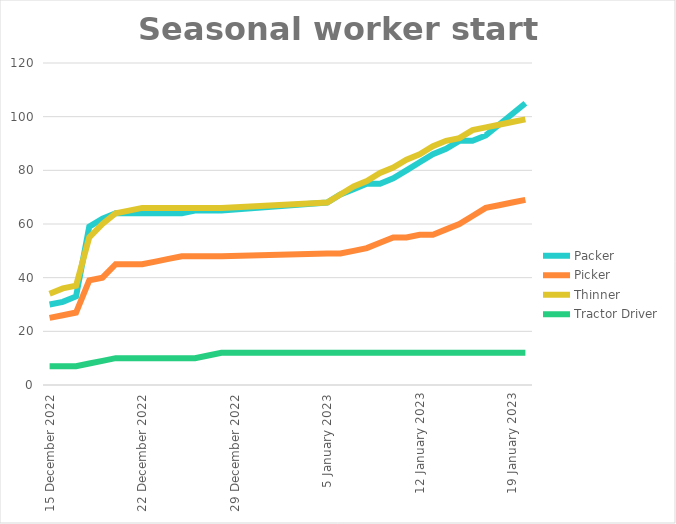
| Category | Packer | Picker | Thinner | Tractor Driver |
|---|---|---|---|---|
| 2022-12-15 | 30 | 25 | 34 | 7 |
| 2022-12-16 | 31 | 26 | 36 | 7 |
| 2022-12-17 | 33 | 27 | 37 | 7 |
| 2022-12-18 | 59 | 39 | 55 | 8 |
| 2022-12-19 | 62 | 40 | 60 | 9 |
| 2022-12-20 | 64 | 45 | 64 | 10 |
| 2022-12-21 | 64 | 45 | 65 | 10 |
| 2022-12-22 | 64 | 45 | 66 | 10 |
| 2022-12-23 | 64 | 46 | 66 | 10 |
| 2022-12-24 | 64 | 47 | 66 | 10 |
| 2022-12-25 | 64 | 48 | 66 | 10 |
| 2022-12-26 | 65 | 48 | 66 | 10 |
| 2022-12-27 | 65 | 48 | 66 | 11 |
| 2022-12-28 | 65 | 48 | 66 | 12 |
| 2023-01-05 | 68 | 49 | 68 | 12 |
| 2023-01-06 | 71 | 49 | 71 | 12 |
| 2023-01-07 | 73 | 50 | 74 | 12 |
| 2023-01-08 | 75 | 51 | 76 | 12 |
| 2023-01-09 | 75 | 53 | 79 | 12 |
| 2023-01-10 | 77 | 55 | 81 | 12 |
| 2023-01-11 | 80 | 55 | 84 | 12 |
| 2023-01-12 | 83 | 56 | 86 | 12 |
| 2023-01-13 | 86 | 56 | 89 | 12 |
| 2023-01-14 | 88 | 58 | 91 | 12 |
| 2023-01-15 | 91 | 60 | 92 | 12 |
| 2023-01-16 | 91 | 63 | 95 | 12 |
| 2023-01-17 | 93 | 66 | 96 | 12 |
| 2023-01-18 | 97 | 67 | 97 | 12 |
| 2023-01-19 | 101 | 68 | 98 | 12 |
| 2023-01-20 | 105 | 69 | 99 | 12 |